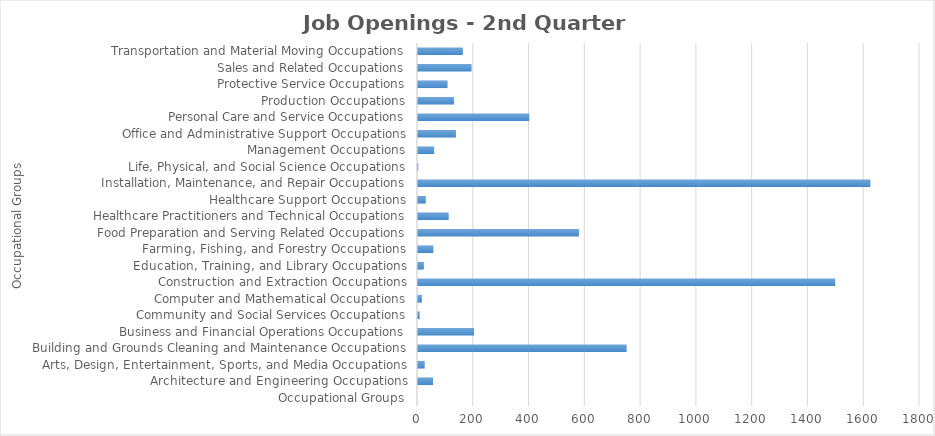
| Category | Series1 |
|---|---|
| Occupational Groups | 0 |
| Architecture and Engineering Occupations | 54 |
| Arts, Design, Entertainment, Sports, and Media Occupations | 24 |
| Building and Grounds Cleaning and Maintenance Occupations | 748 |
| Business and Financial Operations Occupations | 201 |
| Community and Social Services Occupations | 6 |
| Computer and Mathematical Occupations | 14 |
| Construction and Extraction Occupations | 1496 |
| Education, Training, and Library Occupations | 21 |
| Farming, Fishing, and Forestry Occupations | 55 |
| Food Preparation and Serving Related Occupations | 577 |
| Healthcare Practitioners and Technical Occupations | 110 |
| Healthcare Support Occupations | 28 |
| Installation, Maintenance, and Repair Occupations | 1622 |
| Life, Physical, and Social Science Occupations | 1 |
| Management Occupations | 58 |
| Office and Administrative Support Occupations | 136 |
| Personal Care and Service Occupations | 399 |
| Production Occupations | 129 |
| Protective Service Occupations | 106 |
| Sales and Related Occupations | 192 |
| Transportation and Material Moving Occupations | 161 |